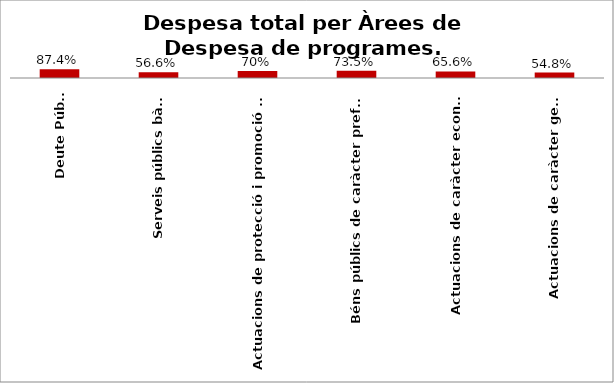
| Category | Series 0 |
|---|---|
| Deute Públic | 0.874 |
| Serveis públics bàsics | 0.566 |
| Actuacions de protecció i promoció social | 0.697 |
| Béns públics de caràcter preferent | 0.735 |
| Actuacions de caràcter econòmic | 0.656 |
| Actuacions de caràcter general | 0.548 |